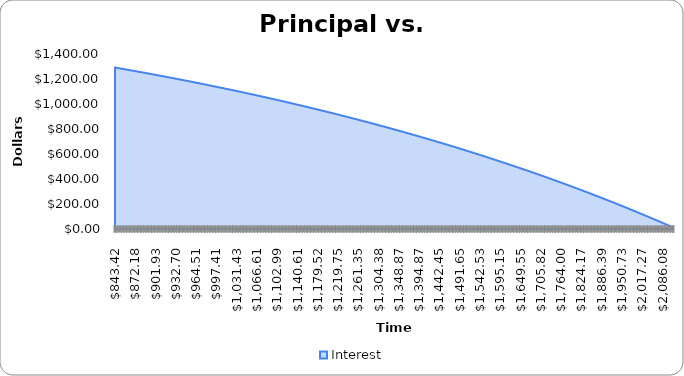
| Category | Interest |
|---|---|
| 843.415327856816 | 1291.667 |
| 845.594150787113 | 1289.488 |
| 847.778602343313 | 1287.303 |
| 849.968697066033 | 1285.113 |
| 852.164449533453 | 1282.918 |
| 854.365874361415 | 1280.716 |
| 856.572986203515 | 1278.509 |
| 858.785799751208 | 1276.296 |
| 861.004329733898 | 1274.078 |
| 863.228590919044 | 1271.853 |
| 865.458598112252 | 1269.623 |
| 867.694366157375 | 1267.388 |
| 869.935909936615 | 1265.146 |
| 872.183244370618 | 1262.899 |
| 874.436384418575 | 1260.646 |
| 876.695345078324 | 1258.387 |
| 878.960141386443 | 1256.122 |
| 881.230788418357 | 1253.851 |
| 883.507301288438 | 1251.575 |
| 885.7896951501 | 1249.292 |
| 888.077985195904 | 1247.004 |
| 890.37218665766 | 1244.71 |
| 892.672314806526 | 1242.41 |
| 894.97838495311 | 1240.104 |
| 897.290412447572 | 1237.792 |
| 899.608412679728 | 1235.474 |
| 901.932401079151 | 1233.15 |
| 904.262393115272 | 1230.82 |
| 906.598404297486 | 1228.484 |
| 908.940450175255 | 1226.142 |
| 911.288546338208 | 1223.793 |
| 913.642708416248 | 1221.439 |
| 916.002952079657 | 1219.079 |
| 918.369293039196 | 1216.713 |
| 920.741747046214 | 1214.34 |
| 923.12032989275 | 1211.962 |
| 925.505057411639 | 1209.577 |
| 927.89594547662 | 1207.186 |
| 930.293010002434 | 1204.789 |
| 932.69626694494 | 1202.386 |
| 935.105732301215 | 1199.976 |
| 937.521422109659 | 1197.561 |
| 939.943352450109 | 1195.139 |
| 942.371539443939 | 1192.71 |
| 944.805999254169 | 1190.276 |
| 947.246748085576 | 1187.835 |
| 949.693802184797 | 1185.388 |
| 952.147177840441 | 1182.935 |
| 954.606891383195 | 1180.475 |
| 957.072959185935 | 1178.009 |
| 959.545397663832 | 1175.537 |
| 962.024223274464 | 1173.058 |
| 964.509452517923 | 1170.573 |
| 967.001101936927 | 1168.081 |
| 969.499188116931 | 1165.583 |
| 972.003727686233 | 1163.078 |
| 974.514737316089 | 1160.567 |
| 977.032233720822 | 1158.05 |
| 979.556233657935 | 1155.526 |
| 982.086753928218 | 1152.995 |
| 984.623811375865 | 1150.458 |
| 987.167422888587 | 1147.915 |
| 989.717605397715 | 1145.364 |
| 992.274375878326 | 1142.808 |
| 994.837751349345 | 1140.244 |
| 997.407748873664 | 1137.674 |
| 999.984385558254 | 1135.098 |
| 1002.56767855428 | 1132.514 |
| 1005.15764505721 | 1129.924 |
| 1007.75430230694 | 1127.328 |
| 1010.3576675879 | 1124.724 |
| 1012.96775822917 | 1122.114 |
| 1015.5845916046 | 1119.497 |
| 1018.20818513291 | 1116.874 |
| 1020.83855627783 | 1114.243 |
| 1023.47572254822 | 1111.606 |
| 1026.11970149814 | 1108.962 |
| 1028.77051072701 | 1106.311 |
| 1031.42816787972 | 1103.654 |
| 1034.09269064674 | 1100.989 |
| 1036.76409676424 | 1098.318 |
| 1039.44240401422 | 1095.64 |
| 1042.12763022459 | 1092.954 |
| 1044.81979326934 | 1090.262 |
| 1047.51891106861 | 1087.563 |
| 1050.22500158887 | 1084.857 |
| 1052.93808284298 | 1082.144 |
| 1055.65817289032 | 1079.424 |
| 1058.38528983696 | 1076.697 |
| 1061.1194518357 | 1073.963 |
| 1063.86067708628 | 1071.221 |
| 1066.60898383542 | 1068.473 |
| 1069.36439037699 | 1065.718 |
| 1072.12691505213 | 1062.955 |
| 1074.89657624935 | 1060.185 |
| 1077.67339240466 | 1057.409 |
| 1080.45738200171 | 1054.625 |
| 1083.24856357188 | 1051.833 |
| 1086.04695569444 | 1049.035 |
| 1088.85257699665 | 1046.229 |
| 1091.66544615389 | 1043.417 |
| 1094.48558188979 | 1040.596 |
| 1097.31300297634 | 1037.769 |
| 1100.14772823403 | 1034.934 |
| 1102.98977653196 | 1032.092 |
| 1105.83916678801 | 1029.243 |
| 1108.69591796887 | 1026.386 |
| 1111.56004909029 | 1023.522 |
| 1114.43157921711 | 1020.65 |
| 1117.31052746342 | 1017.771 |
| 1120.1969129927 | 1014.885 |
| 1123.09075501793 | 1011.991 |
| 1125.99207280173 | 1009.09 |
| 1128.90088565647 | 1006.181 |
| 1131.81721294441 | 1003.265 |
| 1134.74107407785 | 1000.341 |
| 1137.67248851922 | 997.41 |
| 1140.61147578123 | 994.471 |
| 1143.558055427 | 991.524 |
| 1146.51224707018 | 988.57 |
| 1149.47407037511 | 985.608 |
| 1152.44354505692 | 982.638 |
| 1155.42069088165 | 979.661 |
| 1158.40552766642 | 976.676 |
| 1161.39807527956 | 973.684 |
| 1164.3983536407 | 970.684 |
| 1167.40638272094 | 967.676 |
| 1170.42218254297 | 964.66 |
| 1173.44577318121 | 961.636 |
| 1176.47717476192 | 958.605 |
| 1179.51640746339 | 955.566 |
| 1182.56349151601 | 952.519 |
| 1185.61844720242 | 949.464 |
| 1188.68129485769 | 946.401 |
| 1191.75205486941 | 943.33 |
| 1194.83074767782 | 940.251 |
| 1197.91739377599 | 937.165 |
| 1201.01201370991 | 934.07 |
| 1204.11462807866 | 930.967 |
| 1207.22525753453 | 927.857 |
| 1210.34392278316 | 924.738 |
| 1213.47064458369 | 921.611 |
| 1216.60544374886 | 918.477 |
| 1219.74834114521 | 915.334 |
| 1222.89935769317 | 912.183 |
| 1226.05851436721 | 909.023 |
| 1229.22583219599 | 905.856 |
| 1232.4013322625 | 902.681 |
| 1235.58503570418 | 899.497 |
| 1238.77696371308 | 896.305 |
| 1241.97713753601 | 893.105 |
| 1245.18557847464 | 889.896 |
| 1248.4023078857 | 886.68 |
| 1251.62734718107 | 883.455 |
| 1254.86071782796 | 880.221 |
| 1258.10244134901 | 876.98 |
| 1261.3525393225 | 873.729 |
| 1264.61103338241 | 870.471 |
| 1267.87794521865 | 867.204 |
| 1271.15329657713 | 863.929 |
| 1274.43710925996 | 860.645 |
| 1277.72940512554 | 857.353 |
| 1281.03020608879 | 854.052 |
| 1284.33953412118 | 850.742 |
| 1287.65741125099 | 847.425 |
| 1290.98385956339 | 844.098 |
| 1294.3189012006 | 840.763 |
| 1297.66255836203 | 837.419 |
| 1301.01485330447 | 834.067 |
| 1304.37580834217 | 830.706 |
| 1307.74544584706 | 827.337 |
| 1311.12378824883 | 823.958 |
| 1314.51085803514 | 820.571 |
| 1317.90667775173 | 817.175 |
| 1321.31127000259 | 813.771 |
| 1324.72465745009 | 810.357 |
| 1328.14686281517 | 806.935 |
| 1331.57790887745 | 803.504 |
| 1335.01781847538 | 800.064 |
| 1338.46661450644 | 796.615 |
| 1341.92431992725 | 793.158 |
| 1345.39095775373 | 789.691 |
| 1348.86655106126 | 786.215 |
| 1352.35112298483 | 782.731 |
| 1355.84469671921 | 779.237 |
| 1359.34729551907 | 775.735 |
| 1362.85894269916 | 772.223 |
| 1366.37966163446 | 768.702 |
| 1369.90947576035 | 765.173 |
| 1373.44840857273 | 761.634 |
| 1376.99648362821 | 758.086 |
| 1380.55372454425 | 754.528 |
| 1384.12015499933 | 750.962 |
| 1387.69579873307 | 747.386 |
| 1391.28067954647 | 743.801 |
| 1394.87482130196 | 740.207 |
| 1398.47824792366 | 736.604 |
| 1402.09098339746 | 732.991 |
| 1405.71305177124 | 729.369 |
| 1409.34447715498 | 725.738 |
| 1412.98528372097 | 722.097 |
| 1416.63549570391 | 718.446 |
| 1420.29513740115 | 714.787 |
| 1423.96423317277 | 711.118 |
| 1427.6428074418 | 707.439 |
| 1431.33088469435 | 703.751 |
| 1435.02848947981 | 700.054 |
| 1438.73564641097 | 696.346 |
| 1442.4523801642 | 692.63 |
| 1446.17871547962 | 688.903 |
| 1449.91467716128 | 685.167 |
| 1453.66029007728 | 681.422 |
| 1457.41557915998 | 677.666 |
| 1461.18056940614 | 673.901 |
| 1464.95528587711 | 670.127 |
| 1468.73975369896 | 666.342 |
| 1472.53399806268 | 662.548 |
| 1476.33804422434 | 658.744 |
| 1480.15191750525 | 654.93 |
| 1483.97564329214 | 651.106 |
| 1487.80924703731 | 647.273 |
| 1491.65275425883 | 643.429 |
| 1495.50619054066 | 639.576 |
| 1499.36958153289 | 635.712 |
| 1503.24295295185 | 631.839 |
| 1507.12633058031 | 627.956 |
| 1511.01974026764 | 624.062 |
| 1514.92320793 | 620.159 |
| 1518.83675955049 | 616.245 |
| 1522.76042117933 | 612.322 |
| 1526.69421893404 | 608.388 |
| 1530.63817899962 | 604.444 |
| 1534.5923276287 | 600.49 |
| 1538.55669114174 | 596.525 |
| 1542.53129592719 | 592.551 |
| 1546.51616844167 | 588.566 |
| 1550.51133521014 | 584.571 |
| 1554.5168228261 | 580.565 |
| 1558.53265795174 | 576.549 |
| 1562.55886731811 | 572.523 |
| 1566.59547772535 | 568.487 |
| 1570.64251604281 | 564.439 |
| 1574.70000920925 | 560.382 |
| 1578.76798423304 | 556.314 |
| 1582.84646819231 | 552.236 |
| 1586.93548823514 | 548.147 |
| 1591.03507157975 | 544.047 |
| 1595.14524551466 | 539.937 |
| 1599.26603739891 | 535.816 |
| 1603.39747466219 | 531.685 |
| 1607.53958480507 | 527.542 |
| 1611.69239539915 | 523.39 |
| 1615.85593408726 | 519.226 |
| 1620.03022858365 | 515.052 |
| 1624.21530667416 | 510.867 |
| 1628.4111962164 | 506.671 |
| 1632.61792513996 | 502.464 |
| 1636.83552144657 | 498.246 |
| 1641.06401321031 | 494.018 |
| 1645.30342857777 | 489.779 |
| 1649.55379576826 | 485.528 |
| 1653.815143074 | 481.267 |
| 1658.08749886027 | 476.994 |
| 1662.37089156566 | 472.711 |
| 1666.66534970221 | 468.417 |
| 1670.9709018556 | 464.111 |
| 1675.2875766854 | 459.794 |
| 1679.61540292517 | 455.467 |
| 1683.95440938273 | 451.128 |
| 1688.3046249403 | 446.777 |
| 1692.66607855473 | 442.416 |
| 1697.03879925766 | 438.043 |
| 1701.42281615574 | 433.659 |
| 1705.81815843081 | 429.264 |
| 1710.22485534009 | 424.857 |
| 1714.64293621639 | 420.439 |
| 1719.07243046828 | 416.01 |
| 1723.51336758032 | 411.569 |
| 1727.96577711324 | 407.116 |
| 1732.42968870411 | 402.652 |
| 1736.9051320666 | 398.177 |
| 1741.3921369911 | 393.69 |
| 1745.890733345 | 389.191 |
| 1750.40095107281 | 384.681 |
| 1754.92282019641 | 380.159 |
| 1759.45637081525 | 375.626 |
| 1764.00163310652 | 371.08 |
| 1768.55863732538 | 366.523 |
| 1773.12741380514 | 361.955 |
| 1777.70799295747 | 357.374 |
| 1782.30040527261 | 352.782 |
| 1786.90468131956 | 348.177 |
| 1791.52085174631 | 343.561 |
| 1796.14894727998 | 338.933 |
| 1800.78899872712 | 334.293 |
| 1805.44103697384 | 329.641 |
| 1810.10509298602 | 324.977 |
| 1814.78119780957 | 320.301 |
| 1819.46938257057 | 315.613 |
| 1824.16967847555 | 310.912 |
| 1828.88211681161 | 306.2 |
| 1833.60672894671 | 301.475 |
| 1838.34354632982 | 296.738 |
| 1843.09260049117 | 291.989 |
| 1847.85392304244 | 287.228 |
| 1852.62754567697 | 282.454 |
| 1857.41350016996 | 277.668 |
| 1862.21181837874 | 272.87 |
| 1867.02253224288 | 268.059 |
| 1871.84567378451 | 263.236 |
| 1876.68127510845 | 258.401 |
| 1881.52936840248 | 253.553 |
| 1886.38998593752 | 248.692 |
| 1891.26316006786 | 243.819 |
| 1896.14892323137 | 238.933 |
| 1901.04730794972 | 234.035 |
| 1905.95834682859 | 229.124 |
| 1910.88207255789 | 224.2 |
| 1915.818517912 | 219.263 |
| 1920.76771574994 | 214.314 |
| 1925.72969901563 | 209.352 |
| 1930.70450073809 | 204.377 |
| 1935.69215403166 | 199.39 |
| 1940.69269209624 | 194.389 |
| 1945.70614821749 | 189.376 |
| 1950.73255576705 | 184.349 |
| 1955.77194820278 | 179.31 |
| 1960.82435906897 | 174.258 |
| 1965.88982199657 | 169.192 |
| 1970.96837070339 | 164.114 |
| 1976.06003899438 | 159.022 |
| 1981.16486076178 | 153.917 |
| 1986.28286998541 | 148.799 |
| 1991.41410073288 | 143.668 |
| 1996.55858715977 | 138.523 |
| 2001.71636350993 | 133.366 |
| 2006.88746411567 | 128.195 |
| 2012.07192339797 | 123.01 |
| 2017.26977586674 | 117.812 |
| 2022.48105612107 | 112.601 |
| 2027.70579884938 | 107.376 |
| 2032.94403882974 | 102.138 |
| 2038.19581093005 | 96.886 |
| 2043.46115010829 | 91.621 |
| 2048.74009141273 | 86.342 |
| 2054.03266998221 | 81.049 |
| 2059.33892104634 | 75.743 |
| 2064.65887992571 | 70.423 |
| 2069.99258203218 | 65.089 |
| 2075.3400628691 | 59.742 |
| 2080.70135803151 | 54.381 |
| 2086.07650320642 | 49.005 |
| 2091.46553417304 | 43.616 |
| 2096.86848680299 | 38.214 |
| 2102.28539706056 | 32.797 |
| 2107.71630100297 | 27.366 |
| 2113.16123478056 | 21.921 |
| 2118.62023463707 | 16.462 |
| 2124.09333690989 | 10.989 |
| 2129.58057803024 | 5.501 |